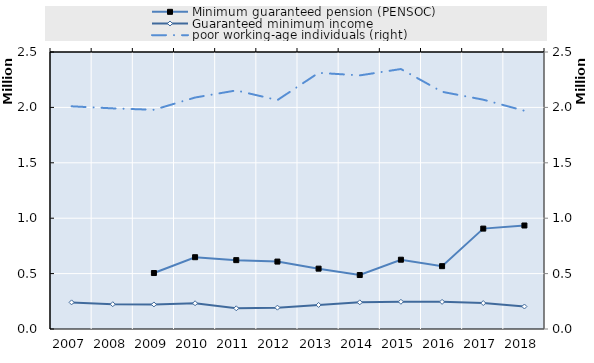
| Category | Minimum guaranteed pension (PENSOC) | Guaranteed minimum income |
|---|---|---|
| 2007.0 | 0 | 240236 |
| 2008.0 | 0 | 223778 |
| 2009.0 | 505156.222 | 221603 |
| 2010.0 | 647846 | 232366 |
| 2011.0 | 621586 | 186704 |
| 2012.0 | 608464.833 | 192713 |
| 2013.0 | 544681 | 217109 |
| 2014.0 | 487157 | 240617 |
| 2015.0 | 625397.75 | 245545 |
| 2016.0 | 567052.75 | 244814 |
| 2017.0 | 906147.75 | 233966 |
| 2018.0 | 934253 | 202976 |